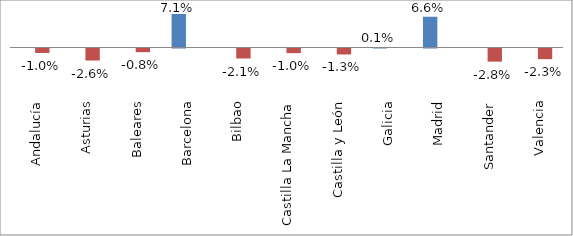
| Category | Mayor | Menor |
|---|---|---|
| Andalucía | 0 | -0.01 |
| Asturias | 0 | -0.026 |
| Baleares | 0 | -0.008 |
| Barcelona | 0.071 | 0 |
| Bilbao | 0 | -0.021 |
| Castilla La Mancha | 0 | -0.01 |
| Castilla y León | 0 | -0.013 |
| Galicia | 0.001 | 0 |
| Madrid | 0.066 | 0 |
| Santander | 0 | -0.028 |
| Valencia | 0 | -0.023 |